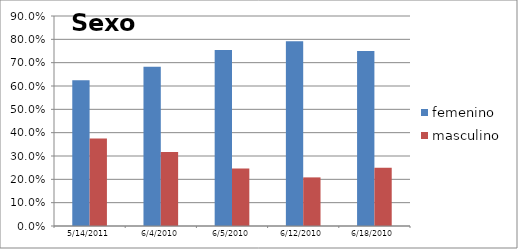
| Category | femenino | masculino |
|---|---|---|
| 14/05/2011 | 0.625 | 0.375 |
| 04/06/2010 | 0.682 | 0.318 |
| 05/06/2010 | 0.754 | 0.246 |
| 12/06/2010 | 0.792 | 0.208 |
| 18/06/2010 | 0.75 | 0.25 |